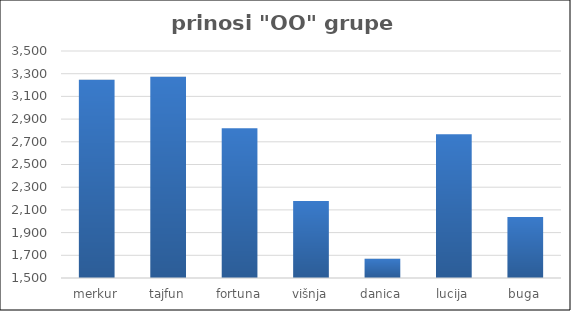
| Category | Series 0 |
|---|---|
| merkur | 3246.92 |
| tajfun | 3272.75 |
| fortuna | 2818.667 |
| višnja | 2178.6 |
| danica | 1670.31 |
| lucija | 2767.495 |
| buga | 2037.4 |